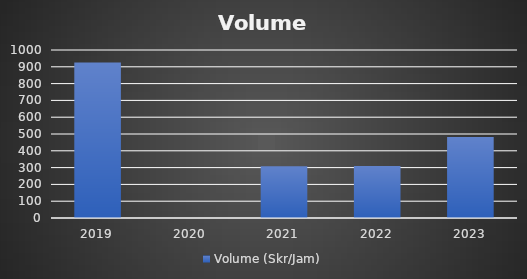
| Category | Volume (Skr/Jam) |
|---|---|
| 2019.0 | 926 |
| 2020.0 | 0 |
| 2021.0 | 308 |
| 2022.0 | 309 |
| 2023.0 | 481.552 |